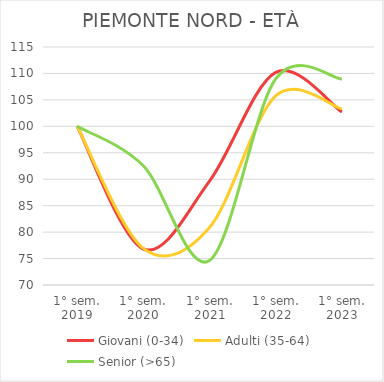
| Category | Giovani (0-34) | Adulti (35-64) | Senior (>65) |
|---|---|---|---|
| 1° sem.
2019 | 100 | 100 | 100 |
| 1° sem.
2020 | 76.808 | 76.936 | 92.537 |
| 1° sem.
2021 | 89.655 | 80.888 | 74.627 |
| 1° sem.
2022 | 110.192 | 105.746 | 108.955 |
| 1° sem.
2023 | 102.716 | 103.301 | 108.955 |